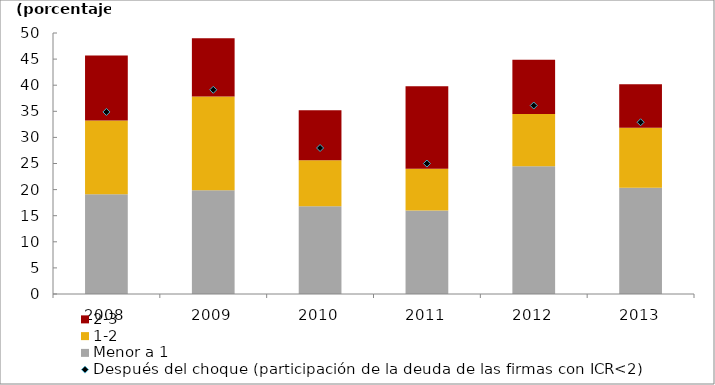
| Category | Menor a 1 | 1-2 | 2-3 |
|---|---|---|---|
| 2008.0 | 19.097 | 14.127 | 12.449 |
| 2009.0 | 19.863 | 17.993 | 11.155 |
| 2010.0 | 16.833 | 8.801 | 9.562 |
| 2011.0 | 16.009 | 8.003 | 15.799 |
| 2012.0 | 24.46 | 10.031 | 10.365 |
| 2013.0 | 20.377 | 11.484 | 8.323 |